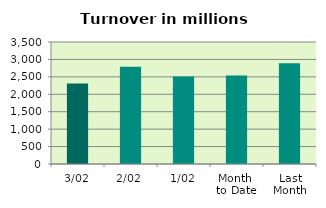
| Category | Series 0 |
|---|---|
| 3/02 | 2312.003 |
| 2/02 | 2788.068 |
| 1/02 | 2507.238 |
| Month 
to Date | 2535.77 |
| Last
Month | 2888.221 |